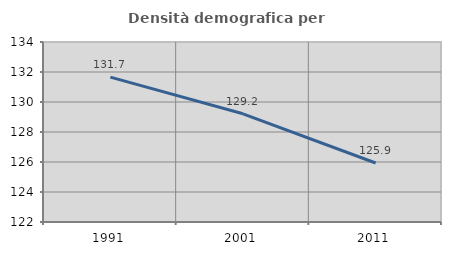
| Category | Densità demografica |
|---|---|
| 1991.0 | 131.657 |
| 2001.0 | 129.214 |
| 2011.0 | 125.935 |